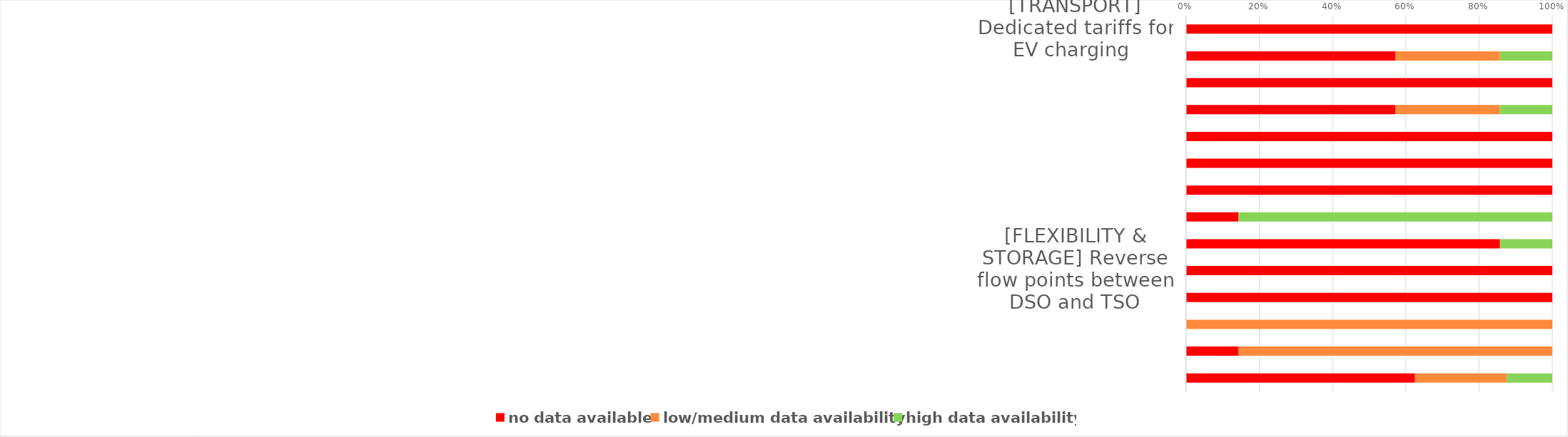
| Category | no data available | low/medium data availability | high data availability |
|---|---|---|---|
| [TRANSPORT] Dedicated tariffs for EV charging  | 7 | 0 | 0 |
| [TRANSPORT]  V2G piloting and other uses for EV batteries within the grid | 4 | 2 | 1 |
| [TRANSPORT]  Active EV load management and optimization | 7 | 0 | 0 |
| [HEATING] Programmes or systems dedicated to managing the increased penetration of heat pumps in the grid  | 4 | 2 | 1 |
| [HEATING] Grid level facilitation of dual energy systems | 7 | 0 | 0 |
| [FLEXIBILITY & STORAGE] Integration of smart meter functionalities for flexibility purposes including real time information on power flows and location dynamic tariffs | 7 | 0 | 0 |
| [FLEXIBILITY & STORAGE] Platform for smart meter data sharing with third parties (e.g. suppliers, aggregators), to ensure interoperability of customers’ data | 7 | 0 | 0 |
| [FLEXIBILITY & STORAGE] Demand response and flexibility services at DSO level | 1 | 0 | 6 |
| [FLEXIBILITY & STORAGE] The procurement of constraint management and reactive power at DSO level | 6 | 0 | 1 |
| [FLEXIBILITY & STORAGE] Reverse flow points between DSO and TSO | 7 | 0 | 0 |
| [FLEXIBILITY & STORAGE] Non-wire alternatives | 7 | 0 | 0 |
| [INDICATIVE PLANNING] Updated indicative planning process taking into account the increased penetration of DERs and their potential contribution to system optimization | 0 | 7 | 0 |
| [INNOVATION] Percentage of OPEX dedicated to decarbonization relevant innovation activities | 1 | 6 | 0 |
| [INNOVATION] Decarbonization relevant innovation activities that have become business-as-usual | 5 | 2 | 1 |